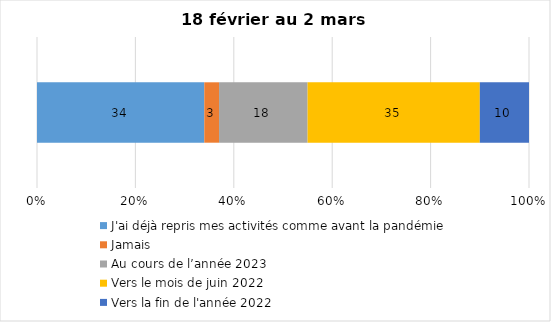
| Category | J'ai déjà repris mes activités comme avant la pandémie | Jamais | Au cours de l’année 2023 | Vers le mois de juin 2022 | Vers la fin de l'année 2022 |
|---|---|---|---|---|---|
| 0 | 34 | 3 | 18 | 35 | 10 |